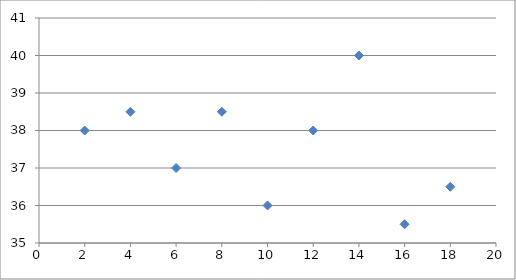
| Category | Series 0 |
|---|---|
| 2.0 | 38 |
| 4.0 | 38.5 |
| 6.0 | 37 |
| 8.0 | 38.5 |
| 10.0 | 36 |
| 12.0 | 38 |
| 14.0 | 40 |
| 16.0 | 35.5 |
| 18.0 | 36.5 |